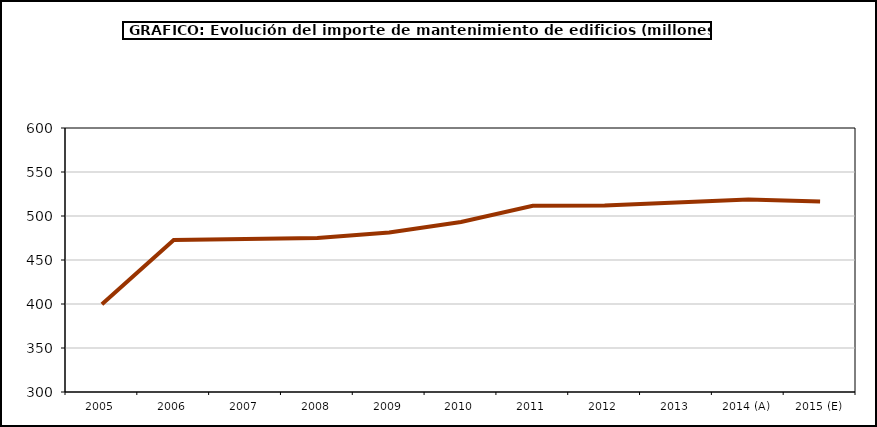
| Category | mantenimiento |
|---|---|
| 2005 | 399.648 |
| 2006 | 472.777 |
| 2007 | 473.87 |
| 2008 | 474.915 |
| 2009 | 481.186 |
| 2010 | 493.233 |
| 2011 | 511.585 |
| 2012 | 512.04 |
| 2013 | 515.387 |
| 2014 (A) | 518.885 |
| 2015 (E) | 516.499 |